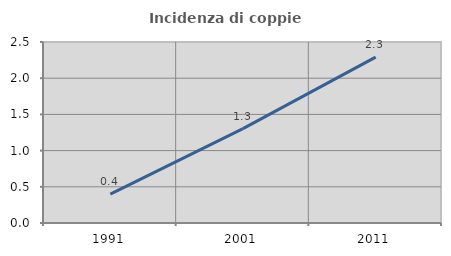
| Category | Incidenza di coppie miste |
|---|---|
| 1991.0 | 0.4 |
| 2001.0 | 1.304 |
| 2011.0 | 2.292 |